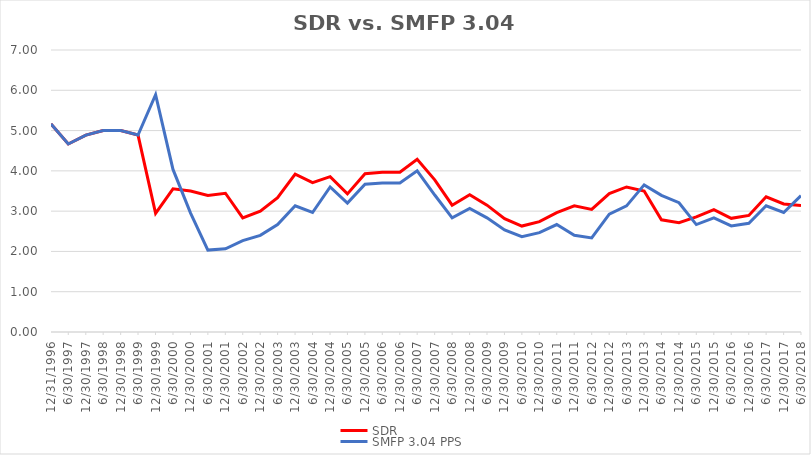
| Category | SDR | SMFP 3.04 PPS |
|---|---|---|
| 12/31/96 | 5.167 | 5.167 |
| 6/30/97 | 4.667 | 4.667 |
| 12/31/97 | 4.889 | 4.889 |
| 6/30/98 | 5 | 5 |
| 12/31/98 | 5 | 5 |
| 6/30/99 | 4.889 | 4.889 |
| 12/31/99 | 2.944 | 5.889 |
| 6/30/00 | 3.556 | 4.035 |
| 12/31/00 | 3.5 | 2.953 |
| 6/30/01 | 3.389 | 2.033 |
| 12/31/01 | 3.444 | 2.067 |
| 6/30/02 | 2.833 | 2.267 |
| 12/31/02 | 3 | 2.4 |
| 6/30/03 | 3.333 | 2.667 |
| 12/31/03 | 3.917 | 3.133 |
| 6/30/04 | 3.708 | 2.967 |
| 12/31/04 | 3.857 | 3.6 |
| 6/30/05 | 3.429 | 3.2 |
| 12/31/05 | 3.929 | 3.667 |
| 6/30/06 | 3.964 | 3.7 |
| 12/31/06 | 3.964 | 3.7 |
| 6/30/07 | 4.286 | 4 |
| 12/31/07 | 3.778 | 3.4 |
| 6/30/08 | 3.148 | 2.833 |
| 12/31/08 | 3.407 | 3.067 |
| 6/30/09 | 3.148 | 2.833 |
| 12/31/09 | 2.815 | 2.533 |
| 6/30/10 | 2.63 | 2.367 |
| 12/31/10 | 2.741 | 2.467 |
| 6/30/11 | 2.963 | 2.667 |
| 12/31/11 | 3.13 | 2.4 |
| 6/30/12 | 3.043 | 2.333 |
| 12/31/12 | 3.435 | 2.926 |
| 6/30/13 | 3.6 | 3.13 |
| 12/31/13 | 3.5 | 3.652 |
| 6/30/14 | 2.786 | 3.391 |
| 12/31/14 | 2.714 | 3.209 |
| 6/30/15 | 2.857 | 2.667 |
| 12/31/15 | 3.036 | 2.833 |
| 6/30/16 | 2.821 | 2.633 |
| 12/31/16 | 2.893 | 2.7 |
| 6/30/17 | 3.357 | 3.133 |
| 12/31/17 | 3.179 | 2.967 |
| 6/30/18 | 3.143 | 3.385 |